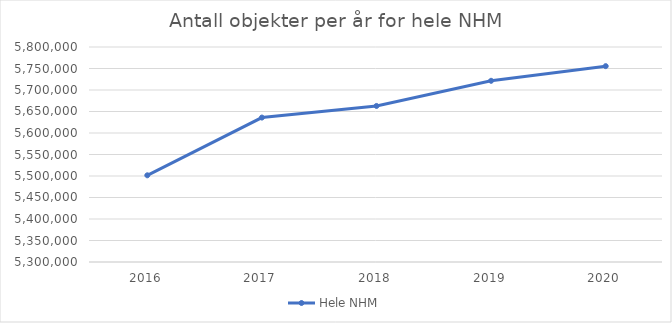
| Category | Hele NHM |
|---|---|
| 2016.0 | 5501632 |
| 2017.0 | 5635883 |
| 2018.0 | 5662896 |
| 2019.0 | 5721401 |
| 2020.0 | 5755473 |